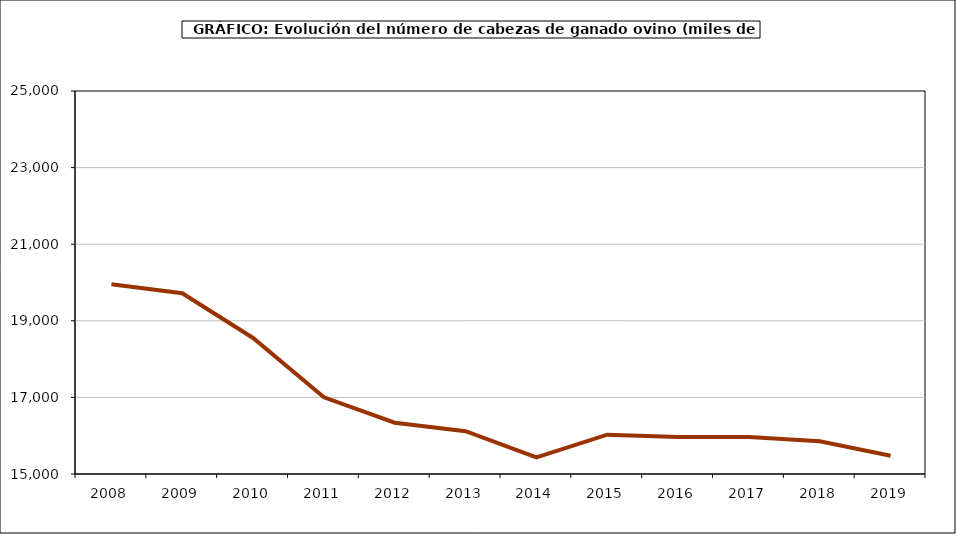
| Category | Series 0 |
|---|---|
| 2008.0 | 19952.282 |
| 2009.0 | 19718.195 |
| 2010.0 | 18552 |
| 2011.0 | 17003 |
| 2012.0 | 16339.373 |
| 2013.0 | 16118.586 |
| 2014.0 | 15431.804 |
| 2015.0 | 16026.374 |
| 2016.0 | 15962.892 |
| 2017.0 | 15963.106 |
| 2018.0 | 15852.525 |
| 2019.0 | 15478 |